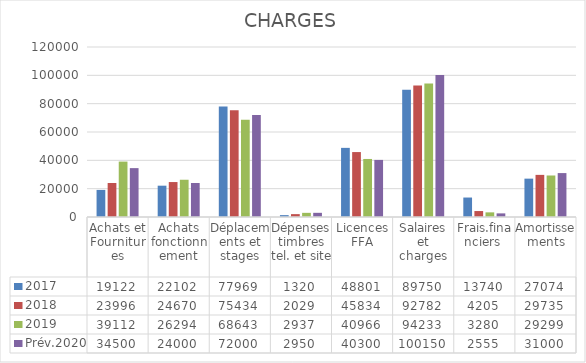
| Category | 2017 | 2018 | 2019 | Prév.2020 |
|---|---|---|---|---|
| Achats et Fournitures | 19122 | 23996 | 39112 | 34500 |
| Achats fonctionnement | 22102 | 24670 | 26294 | 24000 |
| Déplacements et stages | 77969 | 75434 | 68643 | 72000 |
| Dépenses timbres tel. et site | 1320 | 2029 | 2937 | 2950 |
| Licences FFA | 48801 | 45834 | 40966 | 40300 |
| Salaires et charges | 89750 | 92782 | 94233 | 100150 |
| Frais.financiers  | 13740 | 4205 | 3280 | 2555 |
| Amortissements | 27074 | 29735 | 29299 | 31000 |